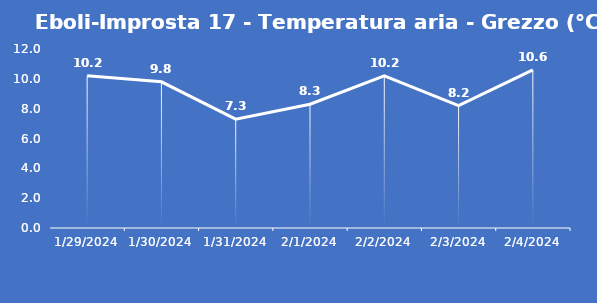
| Category | Eboli-Improsta 17 - Temperatura aria - Grezzo (°C) |
|---|---|
| 1/29/24 | 10.2 |
| 1/30/24 | 9.8 |
| 1/31/24 | 7.3 |
| 2/1/24 | 8.3 |
| 2/2/24 | 10.2 |
| 2/3/24 | 8.2 |
| 2/4/24 | 10.6 |